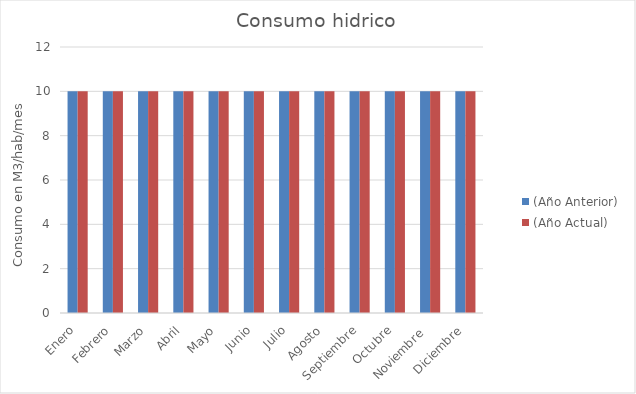
| Category | (Año Anterior) | (Año Actual) |
|---|---|---|
| Enero | 10 | 10 |
| Febrero | 10 | 10 |
| Marzo | 10 | 10 |
| Abril | 10 | 10 |
| Mayo | 10 | 10 |
| Junio | 10 | 10 |
| Julio | 10 | 10 |
| Agosto | 10 | 10 |
| Septiembre | 10 | 10 |
| Octubre | 10 | 10 |
| Noviembre  | 10 | 10 |
| Diciembre | 10 | 10 |